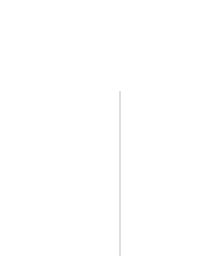
| Category | Positive | Negative |
|---|---|---|
| 0 | 0 | 0 |
| 1 | 169 | 0 |
| 2 | 169 | -169 |